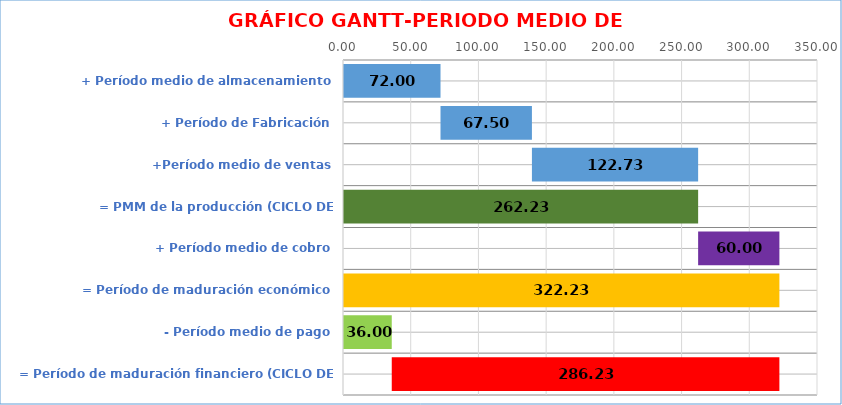
| Category | Series 1 | Series 0 |
|---|---|---|
| + Período medio de almacenamiento | 0 | 72 |
| + Período de Fabricación | 72 | 67.5 |
| +Período medio de ventas | 139.5 | 122.727 |
| = PMM de la producción (CICLO DE PRODUCCIÓN) | 0 | 262.227 |
| + Período medio de cobro | 262.227 | 60 |
| = Período de maduración económico | 0 | 322.227 |
| - Período medio de pago | 0 | 36 |
| = Período de maduración financiero (CICLO DE CAJA) | 36 | 286.227 |